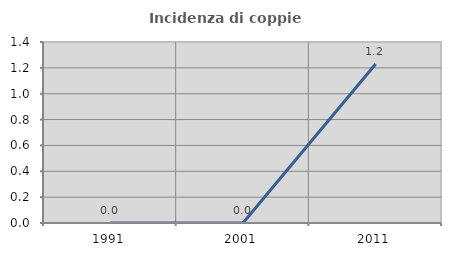
| Category | Incidenza di coppie miste |
|---|---|
| 1991.0 | 0 |
| 2001.0 | 0 |
| 2011.0 | 1.23 |